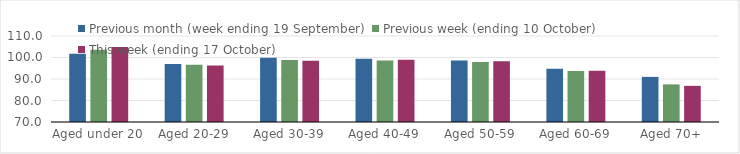
| Category | Previous month (week ending 19 September) | Previous week (ending 10 October) | This week (ending 17 October) |
|---|---|---|---|
| Aged under 20 | 101.78 | 103.62 | 104.89 |
| Aged 20-29 | 96.92 | 96.67 | 96.24 |
| Aged 30-39 | 99.91 | 98.78 | 98.54 |
| Aged 40-49 | 99.46 | 98.57 | 98.96 |
| Aged 50-59 | 98.62 | 97.86 | 98.23 |
| Aged 60-69 | 94.8 | 93.72 | 93.79 |
| Aged 70+ | 90.98 | 87.5 | 86.81 |